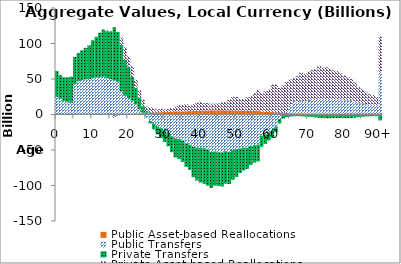
| Category | Public Asset-based Reallocations | Public Transfers | Private Transfers | Private Asset-based Reallocations |
|---|---|---|---|---|
| 0 | 153.308 | 24724.516 | 36451.039 | -145.834 |
|  | 160.479 | 21729.266 | 33412.973 | -9.311 |
| 2 | 171.886 | 18968.228 | 33154.394 | -647.15 |
| 3 | 174.735 | 17174.045 | 35061.608 | -310.88 |
| 4 | 183.033 | 16459.251 | 36668.348 | -138.492 |
| 5 | 194.706 | 42442.48 | 38427.137 | 131.347 |
| 6 | 208.045 | 46932.997 | 39378.187 | 350.446 |
| 7 | 225.064 | 48224.261 | 41990.957 | 470.157 |
| 8 | 242.611 | 49280.019 | 44060.367 | 423.278 |
| 9 | 259.748 | 49811.02 | 47277.034 | 306.83 |
| 10 | 281.939 | 50846.186 | 53507.016 | -45.301 |
| 11 | 304.557 | 51764.013 | 57397.814 | -279.93 |
| 12 | 330.235 | 52360.382 | 62674.616 | 401.767 |
| 13 | 356.837 | 52968.917 | 66345.299 | 621.637 |
| 14 | 362.292 | 50701.295 | 66297.795 | 1354.354 |
| 15 | 433.42 | 49012.43 | 67489.994 | 825.222 |
| 16 | 467.909 | 47281.683 | 75212.452 | -4878.557 |
| 17 | 531.221 | 45506.166 | 70216.541 | -1591.644 |
| 18 | 634.501 | 31841.945 | 65225.287 | 10521.647 |
| 19 | 773.537 | 25484.349 | 50756.911 | 17533.576 |
| 20 | 993.597 | 22210.232 | 44128.949 | 14725.398 |
| 21 | 1253.074 | 18156.303 | 33981.209 | 14557.843 |
| 22 | 1546.962 | 12426.54 | 23387.273 | 11554.889 |
| 23 | 1846.361 | 6192.255 | 15609.599 | 10758.102 |
| 24 | 2058.628 | 326.104 | 9329.658 | 9268.881 |
| 25 | 2297.475 | -4879.297 | 2319.357 | 6508.972 |
| 26 | 2549.868 | -9183.48 | -3434.996 | 7612.064 |
| 27 | 2725.908 | -12743.064 | -8145.249 | 6025.064 |
| 28 | 3029.515 | -16810.761 | -11131.656 | 4137.323 |
| 29 | 3132.6 | -19148.063 | -14010.278 | 5094.586 |
| 30 | 3396.759 | -22180.276 | -16401.673 | 3563.107 |
| 31 | 3749.536 | -25984.836 | -18842.733 | 3810.757 |
| 32 | 4163.46 | -30567.687 | -22546.335 | 5008.875 |
| 33 | 4439.257 | -33691.522 | -26615.181 | 6329.512 |
| 34 | 4369.1 | -34551.149 | -28119.12 | 8705.907 |
| 35 | 4441.408 | -36599.14 | -30269.039 | 9230.986 |
| 36 | 4587.734 | -40579.511 | -33143.713 | 10097.482 |
| 37 | 4826.231 | -42687.036 | -35249.156 | 7655.724 |
| 38 | 5250.538 | -45563.772 | -42711.964 | 9290.482 |
| 39 | 5393.602 | -46591.488 | -46374.239 | 11427.287 |
| 40 | 5444.733 | -46930.3 | -48984.825 | 12807.228 |
| 41 | 5544.634 | -47534.187 | -49918.842 | 10255.963 |
| 42 | 5706.271 | -49685.22 | -50714.935 | 10409.646 |
| 43 | 5917.563 | -52712.472 | -50878.021 | 9247.799 |
| 44 | 5794.621 | -52081.527 | -48137.079 | 9665.862 |
| 45 | 5903.989 | -53204.326 | -47580.096 | 9759.421 |
| 46 | 5922.146 | -53467.2 | -47831.254 | 11164.333 |
| 47 | 5770.218 | -51763.535 | -45579.349 | 12239.39 |
| 48 | 5860.207 | -52662.895 | -45262.488 | 15446.279 |
| 49 | 5667.883 | -50261.585 | -41864.307 | 19291.334 |
| 50 | 5530.762 | -48893.976 | -39208.764 | 19411.991 |
| 51 | 5399.309 | -47848.594 | -34518.916 | 16362.718 |
| 52 | 5300.446 | -46854.899 | -32003.272 | 16687.485 |
| 53 | 5337.79 | -46891.996 | -29680.463 | 18771.201 |
| 54 | 5155.796 | -44459.423 | -26627.867 | 21300.813 |
| 55 | 5107.833 | -43128.644 | -24482.681 | 25146.17 |
| 56 | 5301.016 | -42616.607 | -23442.911 | 29851.221 |
| 57 | 3879.339 | -29949.969 | -15526.211 | 26268.446 |
| 58 | 3732.214 | -28030.53 | -13461.407 | 28947.125 |
| 59 | 3523.536 | -25202.105 | -11555.669 | 31589.492 |
| 60 | 3471.459 | -22651.211 | -10276.749 | 38908.712 |
| 61 | 2894.582 | -17033.674 | -7769.755 | 39397.106 |
| 62 | 2526.771 | -6347.556 | -6228.481 | 34926.205 |
| 63 | 2311.817 | -810.959 | -4985.422 | 38242.788 |
| 64 | 2077.691 | 2489.887 | -3526.312 | 41420.712 |
| 65 | 1930.181 | 11186.797 | -2956.226 | 36163.374 |
| 66 | 1732.959 | 17755.476 | -2435.625 | 32140.881 |
| 67 | 1633.598 | 15493.734 | -2221.728 | 36751.756 |
| 68 | 1579.28 | 17741.629 | -2621.646 | 39752.086 |
| 69 | 1401.982 | 17065.681 | -2783.571 | 38501.189 |
| 70 | 1366.398 | 17866.736 | -3100.435 | 40922.785 |
| 71 | 1323.471 | 19428.656 | -3515.678 | 41970.88 |
| 72 | 1286.928 | 19765.483 | -4054.081 | 43698.119 |
| 73 | 1282.14 | 21209.758 | -4645.926 | 45989.478 |
| 74 | 1190.984 | 19792.561 | -4951.41 | 44843.808 |
| 75 | 1162.851 | 20701.136 | -5273.732 | 44597.59 |
| 76 | 1106.134 | 20901.434 | -5208.661 | 42809.746 |
| 77 | 1036.206 | 20235.05 | -5061.402 | 40951.961 |
| 78 | 998.761 | 20645.507 | -5040.933 | 39623.791 |
| 79 | 925.195 | 20110.363 | -5042.229 | 36969.335 |
| 80 | 849.006 | 19020.469 | -5103.93 | 35049.318 |
| 81 | 791.724 | 19050.453 | -5163.356 | 33020.332 |
| 82 | 719.499 | 18819.645 | -4847.664 | 30522.301 |
| 83 | 640.672 | 17296.619 | -4432.667 | 27387.055 |
| 84 | 527.656 | 15011.18 | -3614.065 | 23105.658 |
| 85 | 473.516 | 14957.475 | -3226.437 | 20718.56 |
| 86 | 389.762 | 13978.01 | -2763.66 | 17659.418 |
| 87 | 326.902 | 13707.981 | -2588.823 | 14741.825 |
| 88 | 274.36 | 13609.733 | -2435.31 | 13393.787 |
| 89 | 219.197 | 12599.844 | -2166.987 | 11354.521 |
| 90+ | 780.483 | 58663.051 | -8228.032 | 50426.536 |